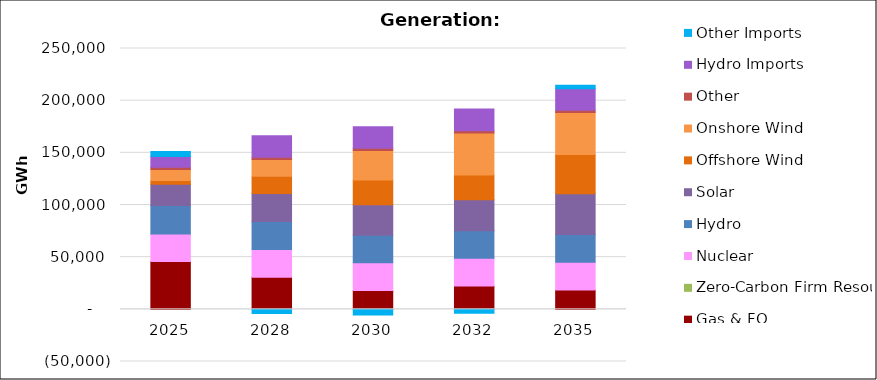
| Category | Gas & FO | Zero-Carbon Firm Resources | Nuclear | Hydro | Solar | Offshore Wind | Onshore Wind | Other | Hydro Imports | Other Imports |
|---|---|---|---|---|---|---|---|---|---|---|
| 2025.0 | 45756.82 | 0 | 26550.05 | 27123.48 | 20416.26 | 3560.16 | 10545.91 | 2169.7 | 10361.35 | 4882.18 |
| 2028.0 | 30803.67 | 0 | 26550.05 | 26816.67 | 26771.96 | 16567.84 | 16047.39 | 2108.9 | 20763.85 | -3880.14 |
| 2030.0 | 18037.29 | 0 | 26550.05 | 26385.4 | 29315.97 | 23788.54 | 28151.19 | 2100.72 | 20763.85 | -5468.05 |
| 2032.0 | 22337.37 | 0 | 26550.05 | 26452.03 | 29580.02 | 23788.54 | 40348.14 | 2100.72 | 20763.85 | -3822.7 |
| 2035.0 | 18582.06 | 0 | 26550.05 | 26542.71 | 39085.76 | 37562.44 | 40348.14 | 2100.72 | 20763.85 | 3214.23 |